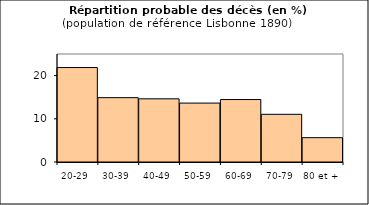
| Category | Series 0 |
|---|---|
| 20-29 | 21.862 |
| 30-39 | 14.891 |
| 40-49 | 14.624 |
| 50-59 | 13.636 |
| 60-69 | 14.459 |
| 70-79 | 11.039 |
| 80 et + | 5.628 |